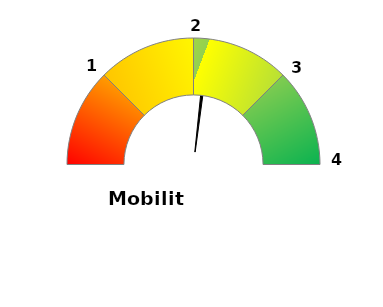
| Category | Variable | Fixe |
|---|---|---|
| 0.0 | 0.533 | 0 |
| 1.0 | 0.01 | 25 |
| 2.0 | 0.457 | 25 |
| 3.0 | 0 | 25 |
| 4.0 | 0 | 25 |
| 5.0 | 1 | 100 |